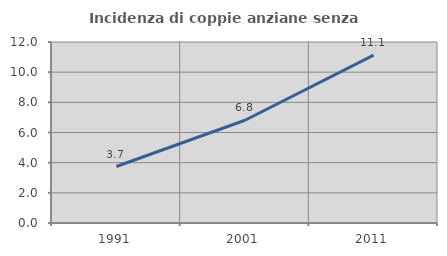
| Category | Incidenza di coppie anziane senza figli  |
|---|---|
| 1991.0 | 3.745 |
| 2001.0 | 6.812 |
| 2011.0 | 11.134 |